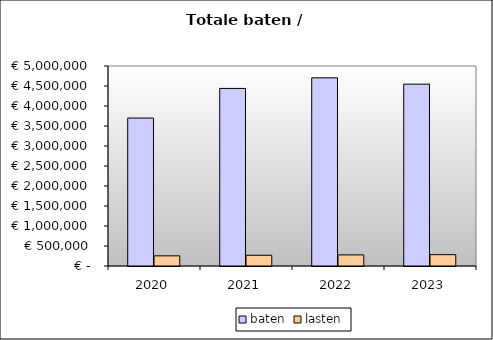
| Category | baten | lasten |
|---|---|---|
| 2020.0 | 3698368.17 | 253648.133 |
| 2021.0 | 4439074.968 | 268172.8 |
| 2022.0 | 4704468.922 | 277716.8 |
| 2023.0 | 4546467.434 | 283473.6 |